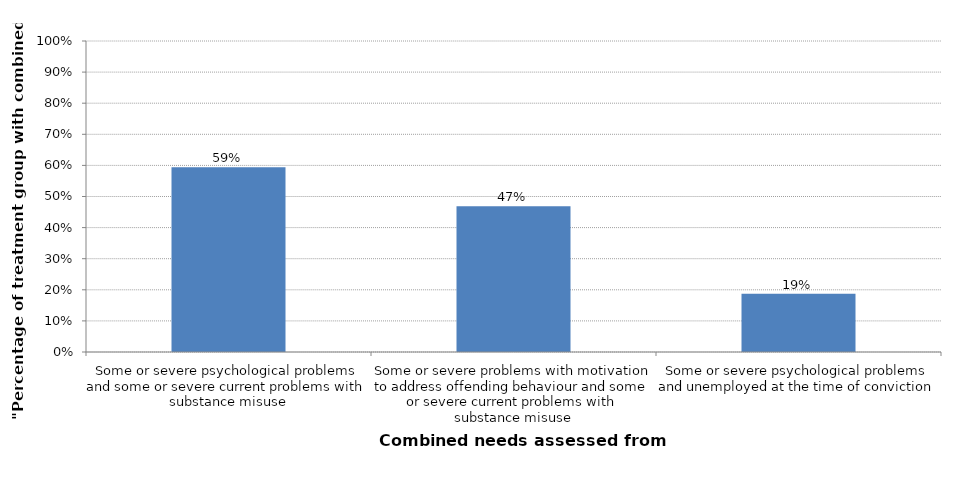
| Category | Series 0 |
|---|---|
| Some or severe psychological problems and some or severe current problems with substance misuse | 0.594 |
| Some or severe problems with motivation to address offending behaviour and some or severe current problems with substance misuse | 0.469 |
| Some or severe psychological problems and unemployed at the time of conviction | 0.188 |